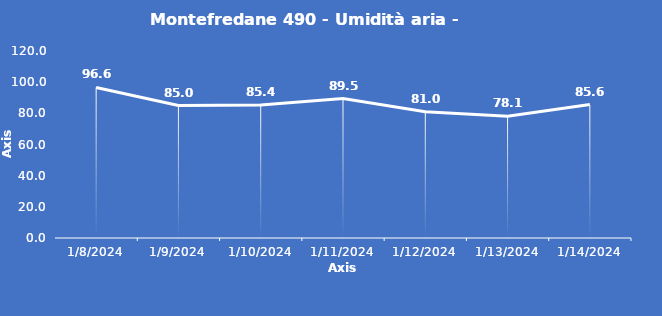
| Category | Montefredane 490 - Umidità aria - Grezzo (%) |
|---|---|
| 1/8/24 | 96.6 |
| 1/9/24 | 85 |
| 1/10/24 | 85.4 |
| 1/11/24 | 89.5 |
| 1/12/24 | 81 |
| 1/13/24 | 78.1 |
| 1/14/24 | 85.6 |